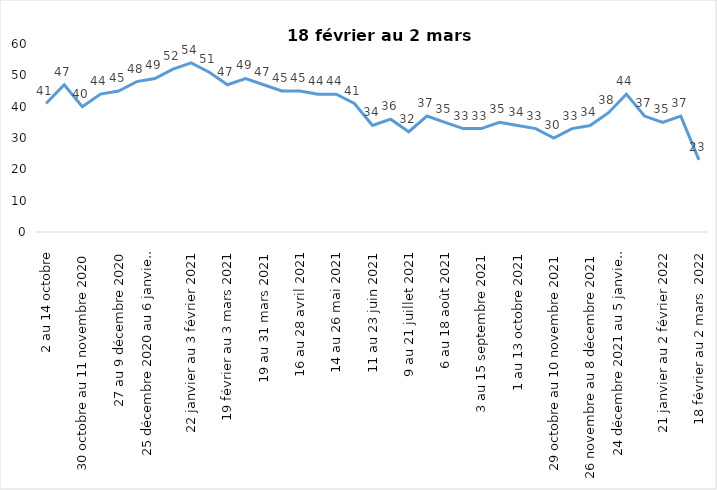
| Category | Toujours aux trois mesures |
|---|---|
| 2 au 14 octobre | 41 |
| 16 au 28 octobre 2020 | 47 |
| 30 octobre au 11 novembre 2020 | 40 |
| 13 au 25 novembre 2020 | 44 |
| 27 au 9 décembre 2020 | 45 |
| 11 au 25 décembre 2020 | 48 |
| 25 décembre 2020 au 6 janvier 2021 | 49 |
| 8 au 20 janvier 2021 | 52 |
| 22 janvier au 3 février 2021 | 54 |
| 5 au 17 février 2021 | 51 |
| 19 février au 3 mars 2021 | 47 |
| 5 au 17 mars 2021 | 49 |
| 19 au 31 mars 2021 | 47 |
| 2 au 14 avril 2021 | 45 |
| 16 au 28 avril 2021 | 45 |
| 30 avril au 12 mai 2021 | 44 |
| 14 au 26 mai 2021 | 44 |
| 28 mai au 9 juin 2021 | 41 |
| 11 au 23 juin 2021 | 34 |
| 25 juin au 7 juillet 2021 | 36 |
| 9 au 21 juillet 2021 | 32 |
| 23 au 4 août 2021 | 37 |
| 6 au 18 août 2021 | 35 |
| 20 août au 1er septembre 2021 | 33 |
| 3 au 15 septembre 2021 | 33 |
| 17 au 29 septembre 2021 | 35 |
| 1 au 13 octobre 2021 | 34 |
| 15 au 27 octobre 2021 | 33 |
| 29 octobre au 10 novembre 2021 | 30 |
| 12 au 24 novembre 2021 | 33 |
| 26 novembre au 8 décembre 2021 | 34 |
| 10 au 22 décembre 2021 | 38 |
| 24 décembre 2021 au 5 janvier 2022 2022 | 44 |
| 7 au 19 janvier 2022 | 37 |
| 21 janvier au 2 février 2022 | 35 |
| 4 au 16 février 2022 | 37 |
| 18 février au 2 mars  2022 | 23 |